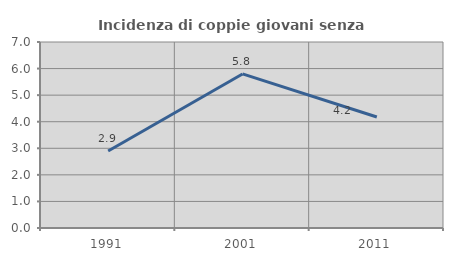
| Category | Incidenza di coppie giovani senza figli |
|---|---|
| 1991.0 | 2.897 |
| 2001.0 | 5.798 |
| 2011.0 | 4.176 |